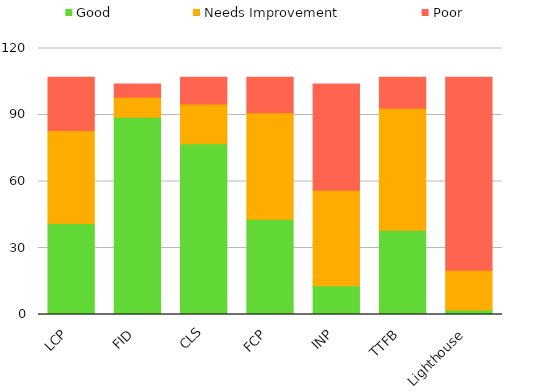
| Category | Good | Needs Improvement | Poor |
|---|---|---|---|
| LCP | 41 | 42 | 24 |
| FID | 89 | 9 | 6 |
| CLS | 77 | 18 | 12 |
| FCP | 43 | 48 | 16 |
| INP | 13 | 43 | 48 |
| TTFB | 38 | 55 | 14 |
| Lighthouse | 2 | 18 | 87 |